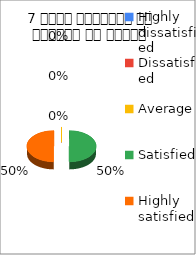
| Category | 7 विषय अवधारणा पर शिक्षक का ज्ञान  |
|---|---|
| Highly dissatisfied | 0 |
| Dissatisfied | 0 |
| Average | 0 |
| Satisfied | 3 |
| Highly satisfied | 3 |